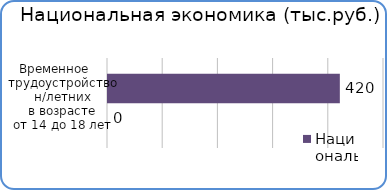
| Category | Факт | План  |
|---|---|---|
| Временное трудоустройство несовершеннолетних в возрасте от 14 до 18 лет | 0 | 420000 |